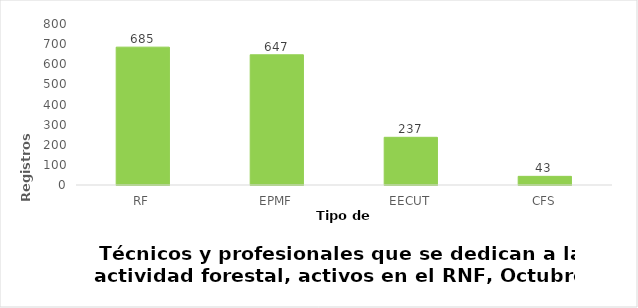
| Category | Series 0 |
|---|---|
| RF | 685 |
| EPMF | 647 |
| EECUT | 237 |
| CFS | 43 |